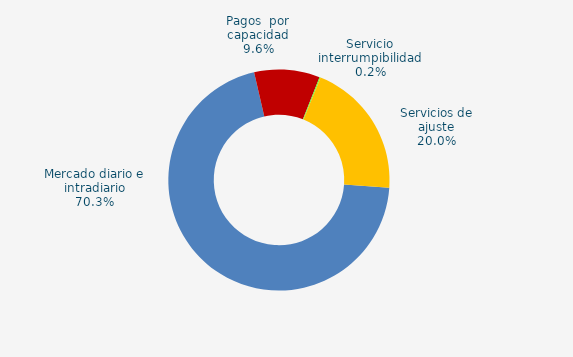
| Category | Series 0 |
|---|---|
| Mercado diario e intradiario | 17.8 |
| Pagos  por capacidad | 2.43 |
| Servicio interrumpibilidad | 0.04 |
| Servicios de ajuste | 5.06 |